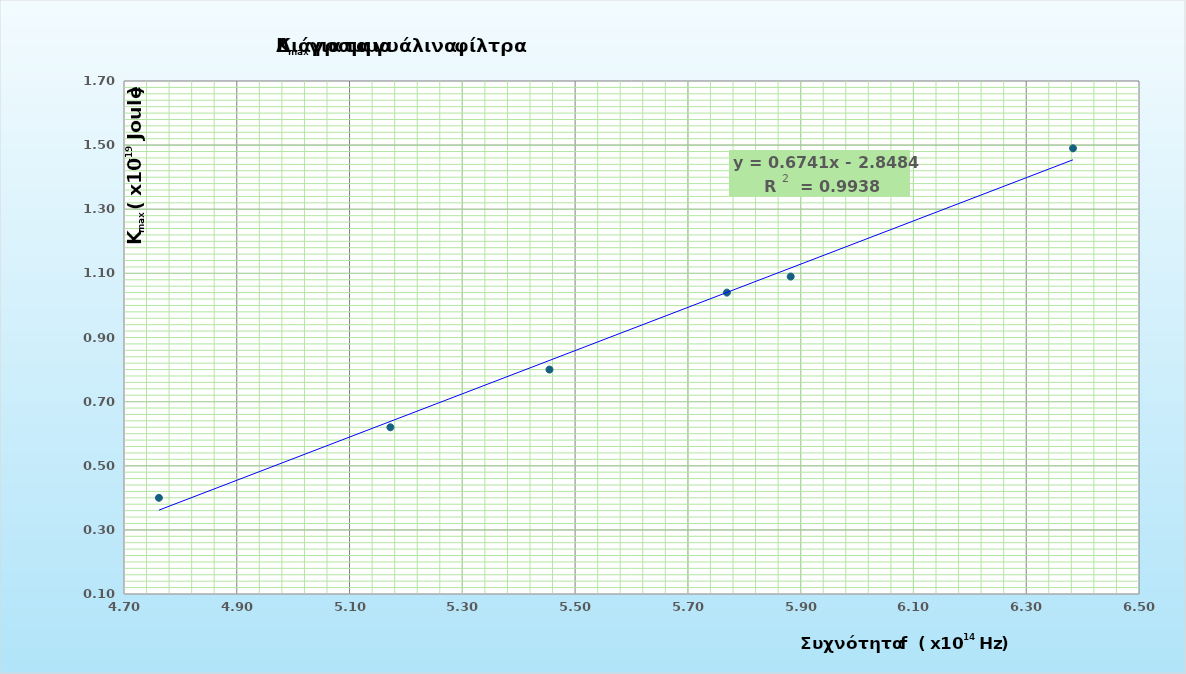
| Category | Kmax (x10^-19 Joule) (Kmax =qe*V) |
|---|---|
| 4.76190476190476 | 0.4 |
| 5.17241379310345 | 0.62 |
| 5.45454545454545 | 0.8 |
| 5.88235294117647 | 1.09 |
| 5.76923076923077 | 1.04 |
| 6.38297872340426 | 1.49 |